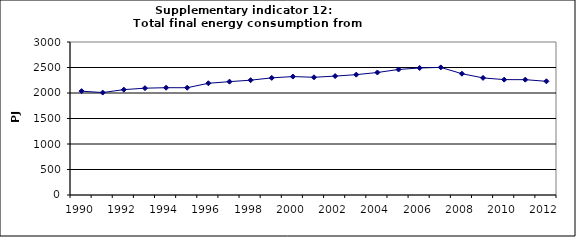
| Category | Total final energy consumption from transport, PJ |
|---|---|
| 1990 | 2036.25 |
| 1991 | 2008.534 |
| 1992 | 2066.395 |
| 1993 | 2094.405 |
| 1994 | 2103.993 |
| 1995 | 2103.365 |
| 1996 | 2190.592 |
| 1997 | 2222.459 |
| 1998 | 2251.326 |
| 1999 | 2296.589 |
| 2000 | 2322.046 |
| 2001 | 2308.488 |
| 2002 | 2331.413 |
| 2003 | 2359.923 |
| 2004 | 2402.141 |
| 2005 | 2461.128 |
| 2006 | 2490.696 |
| 2007 | 2502.039 |
| 2008 | 2378.077 |
| 2009 | 2296.079 |
| 2010 | 2262.526 |
| 2011 | 2261.141 |
| 2012 | 2229.404 |